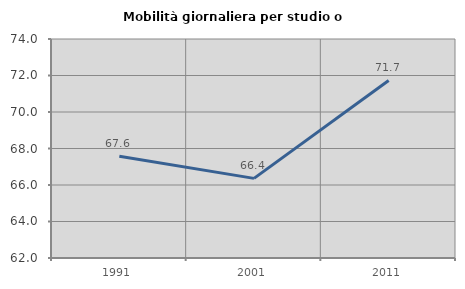
| Category | Mobilità giornaliera per studio o lavoro |
|---|---|
| 1991.0 | 67.576 |
| 2001.0 | 66.364 |
| 2011.0 | 71.727 |